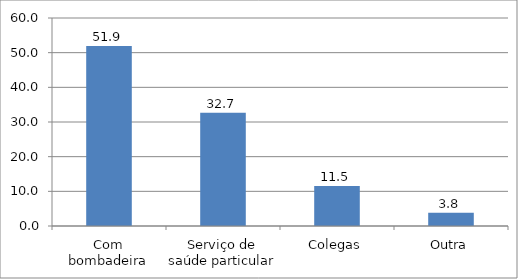
| Category | Series 0 |
|---|---|
| Com bombadeira | 51.923 |
| Serviço de saúde particular | 32.692 |
| Colegas | 11.538 |
| Outra | 3.846 |